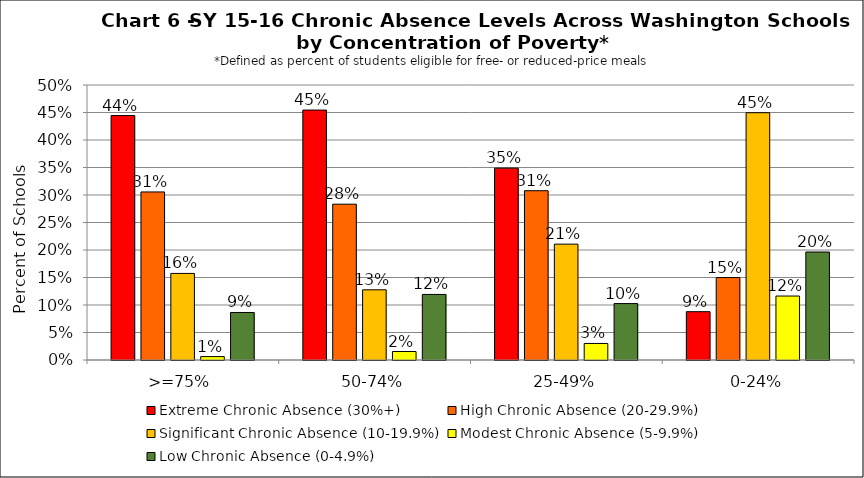
| Category | Extreme Chronic Absence (30%+) | High Chronic Absence (20-29.9%) | Significant Chronic Absence (10-19.9%) | Modest Chronic Absence (5-9.9%) | Low Chronic Absence (0-4.9%) |
|---|---|---|---|---|---|
| 0 | 0.444 | 0.306 | 0.157 | 0.006 | 0.086 |
| 1 | 0.454 | 0.283 | 0.128 | 0.015 | 0.119 |
| 2 | 0.349 | 0.308 | 0.211 | 0.03 | 0.103 |
| 3 | 0.088 | 0.15 | 0.45 | 0.116 | 0.196 |